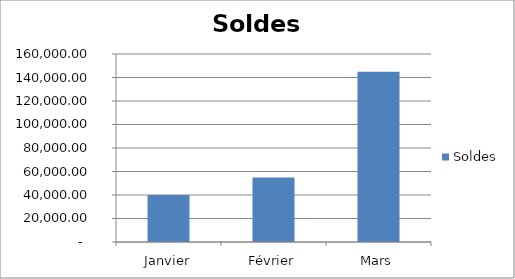
| Category | Soldes |
|---|---|
| Janvier | 40000 |
| Février | 55000 |
| Mars | 145000 |